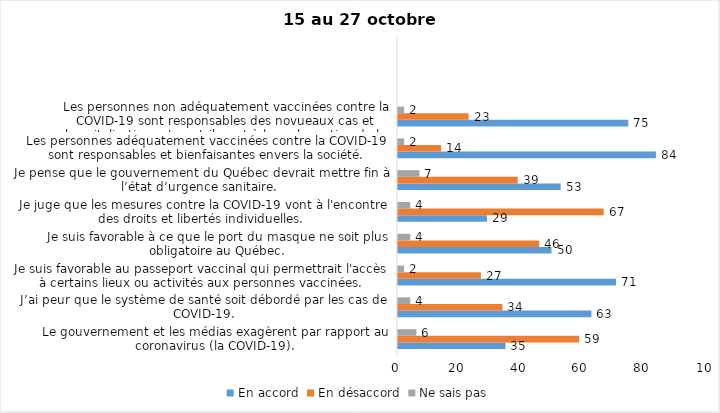
| Category | En accord | En désaccord | Ne sais pas |
|---|---|---|---|
| Le gouvernement et les médias exagèrent par rapport au coronavirus (la COVID-19). | 35 | 59 | 6 |
| J’ai peur que le système de santé soit débordé par les cas de COVID-19. | 63 | 34 | 4 |
| Je suis favorable au passeport vaccinal qui permettrait l'accès à certains lieux ou activités aux personnes vaccinées. | 71 | 27 | 2 |
| Je suis favorable à ce que le port du masque ne soit plus obligatoire au Québec. | 50 | 46 | 4 |
| Je juge que les mesures contre la COVID-19 vont à l'encontre des droits et libertés individuelles.  | 29 | 67 | 4 |
| Je pense que le gouvernement du Québec devrait mettre fin à l’état d’urgence sanitaire.  | 53 | 39 | 7 |
| Les personnes adéquatement vaccinées contre la COVID-19 sont responsables et bienfaisantes envers la société. | 84 | 14 | 2 |
| Les personnes non adéquatement vaccinées contre la COVID-19 sont responsables des novueaux cas et hospitalisations et contribuent à la prolongation de la pandémie au Québec. | 75 | 23 | 2 |